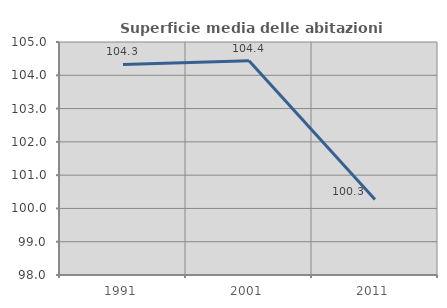
| Category | Superficie media delle abitazioni occupate |
|---|---|
| 1991.0 | 104.326 |
| 2001.0 | 104.438 |
| 2011.0 | 100.266 |